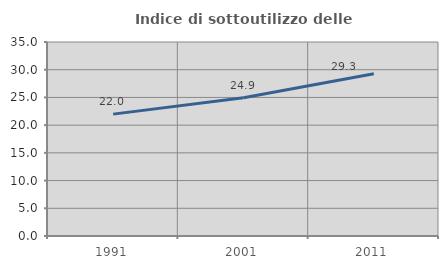
| Category | Indice di sottoutilizzo delle abitazioni  |
|---|---|
| 1991.0 | 21.989 |
| 2001.0 | 24.946 |
| 2011.0 | 29.29 |